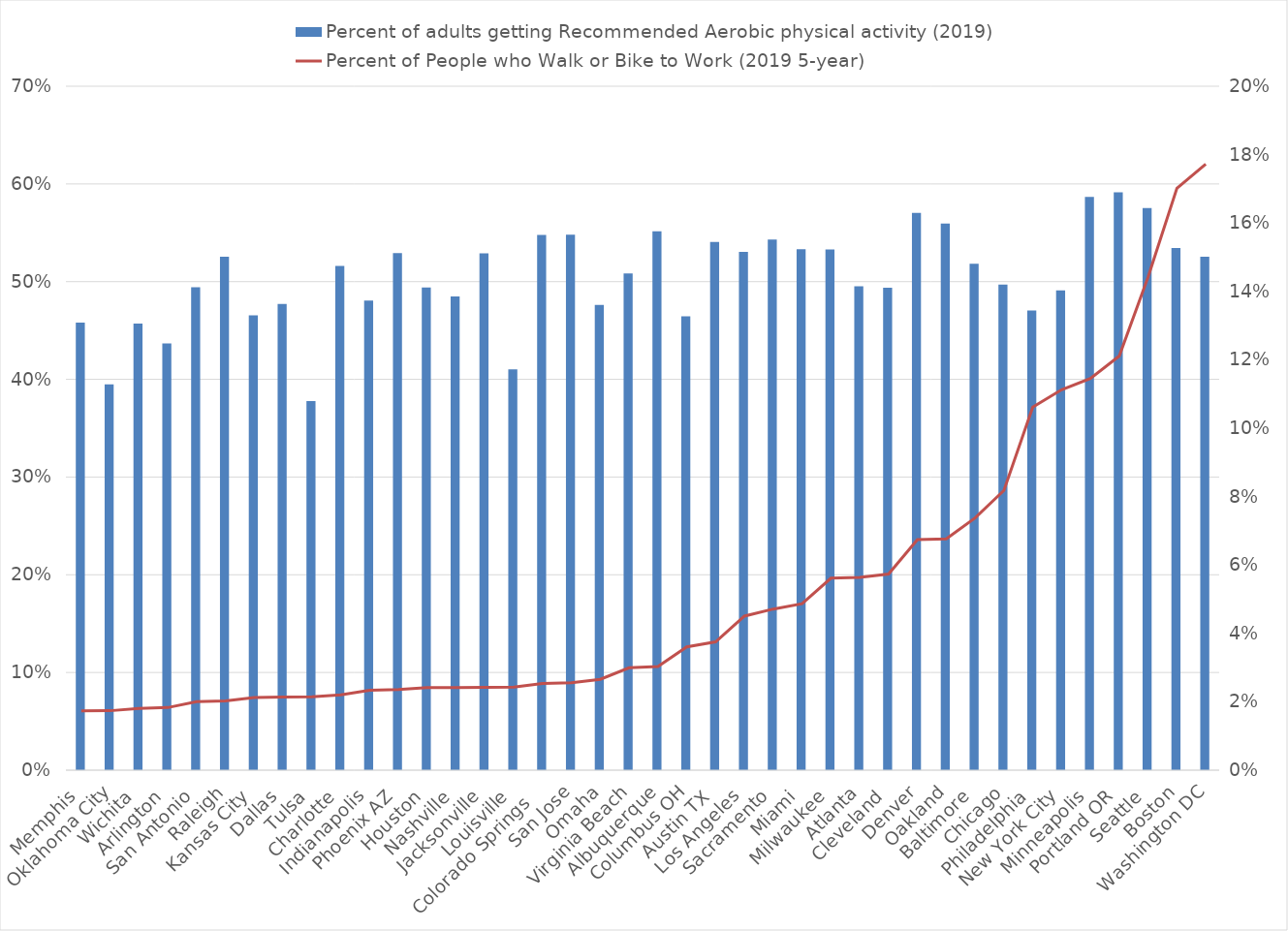
| Category | Percent of adults getting Recommended Aerobic physical activity (2019) |
|---|---|
| Memphis | 0.458 |
| Oklahoma City | 0.395 |
| Wichita | 0.457 |
| Arlington | 0.437 |
| San Antonio | 0.494 |
| Raleigh | 0.525 |
| Kansas City | 0.465 |
| Dallas | 0.477 |
| Tulsa | 0.378 |
| Charlotte | 0.516 |
| Indianapolis | 0.481 |
| Phoenix AZ | 0.529 |
| Houston | 0.494 |
| Nashville | 0.485 |
| Jacksonville | 0.529 |
| Louisville | 0.41 |
| Colorado Springs   | 0.548 |
| San Jose | 0.548 |
| Omaha | 0.476 |
| Virginia Beach | 0.509 |
| Albuquerque | 0.552 |
| Columbus OH | 0.464 |
| Austin TX | 0.541 |
| Los Angeles | 0.53 |
| Sacramento | 0.543 |
| Miami | 0.533 |
| Milwaukee | 0.533 |
| Atlanta | 0.495 |
| Cleveland | 0.494 |
| Denver | 0.57 |
| Oakland | 0.559 |
| Baltimore | 0.518 |
| Chicago | 0.497 |
| Philadelphia | 0.47 |
| New York City | 0.491 |
| Minneapolis | 0.587 |
| Portland OR | 0.592 |
| Seattle | 0.575 |
| Boston | 0.534 |
| Washington DC | 0.526 |